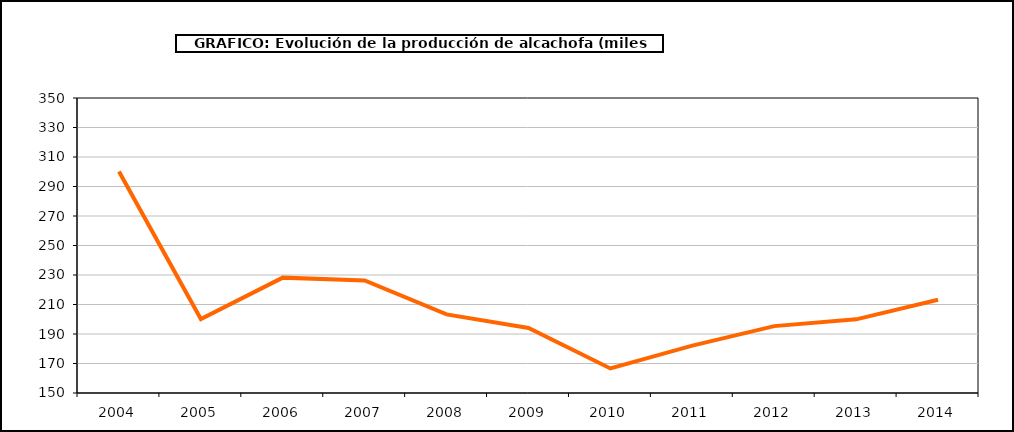
| Category | producción |
|---|---|
| 2004.0 | 300.216 |
| 2005.0 | 200.135 |
| 2006.0 | 228.219 |
| 2007.0 | 226.281 |
| 2008.0 | 203.301 |
| 2009.0 | 194.099 |
| 2010.0 | 166.662 |
| 2011.0 | 182.1 |
| 2012.0 | 195.342 |
| 2013.0 | 199.945 |
| 2014.0 | 213.258 |